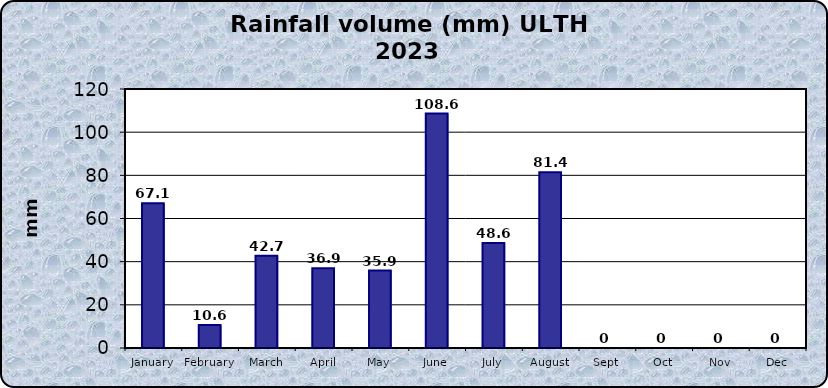
| Category | Series 0 |
|---|---|
| January | 67.1 |
| February | 10.6 |
| March | 42.7 |
| April | 36.9 |
| May | 35.9 |
| June | 108.6 |
| July | 48.6 |
| August | 81.4 |
| Sept | 0 |
| Oct | 0 |
| Nov | 0 |
| Dec | 0 |